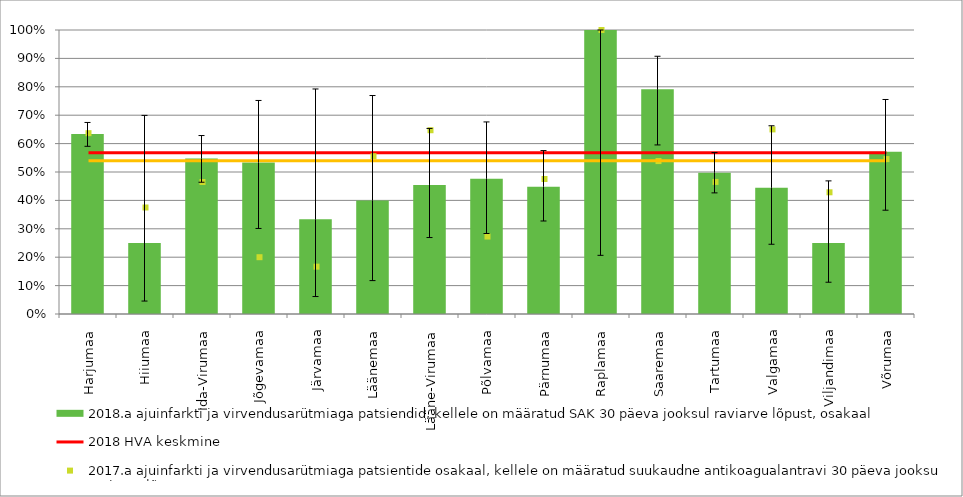
| Category | 2018.a ajuinfarkti ja virvendusarütmiaga patsiendid, kellele on määratud SAK 30 päeva jooksul raviarve lõpust, osakaal |
|---|---|
| Harjumaa | 0.633 |
| Hiiumaa | 0.25 |
| Ida-Virumaa | 0.547 |
| Jõgevamaa | 0.533 |
| Järvamaa | 0.333 |
| Läänemaa | 0.4 |
| Lääne-Virumaa | 0.455 |
| Põlvamaa | 0.476 |
| Pärnumaa | 0.448 |
| Raplamaa | 1 |
| Saaremaa | 0.792 |
| Tartumaa | 0.497 |
| Valgamaa | 0.444 |
| Viljandimaa | 0.25 |
| Võrumaa | 0.571 |